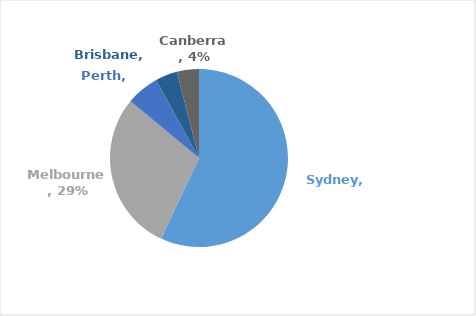
| Category | Series 0 |
|---|---|
| Sydney | 0.57 |
| Melbourne | 0.29 |
| Perth | 0.06 |
| Brisbane | 0.04 |
| Canberra | 0.04 |